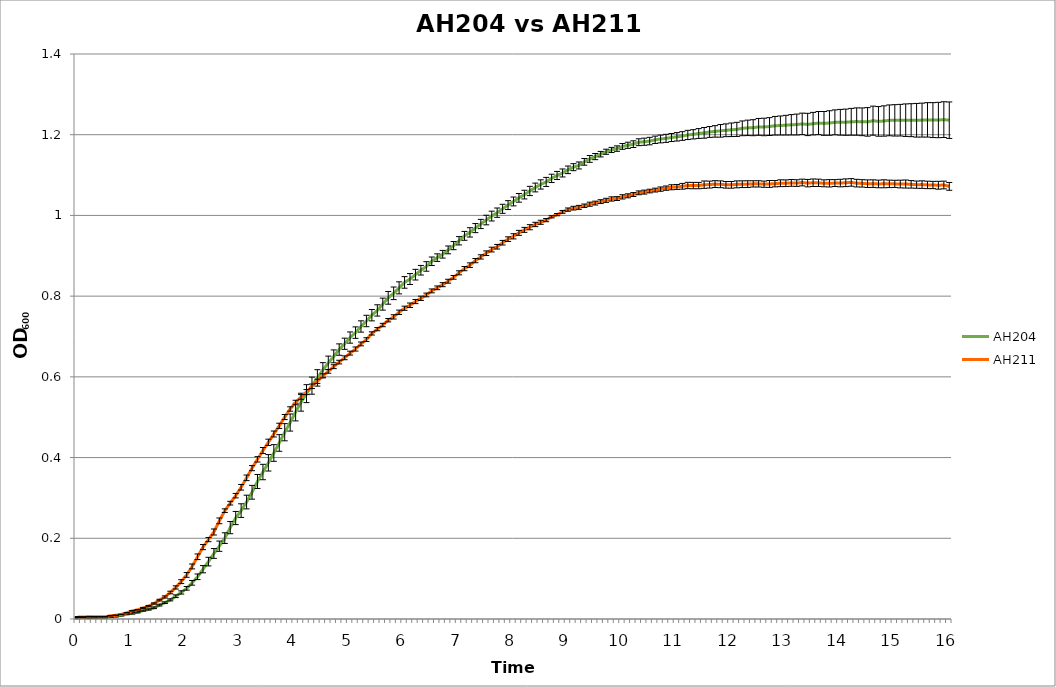
| Category | AH204 | AH211 |
|---|---|---|
| 0.0 | 0.002 | 0.005 |
| nan | 0.004 | 0.005 |
| nan | 0.003 | 0.006 |
| nan | 0.004 | 0.005 |
| nan | 0.004 | 0.005 |
| nan | 0.004 | 0.005 |
| nan | 0.006 | 0.008 |
| nan | 0.007 | 0.009 |
| nan | 0.009 | 0.011 |
| nan | 0.012 | 0.015 |
| 1.0 | 0.014 | 0.02 |
| nan | 0.017 | 0.023 |
| nan | 0.021 | 0.027 |
| nan | 0.024 | 0.032 |
| nan | 0.028 | 0.038 |
| nan | 0.034 | 0.047 |
| nan | 0.04 | 0.055 |
| nan | 0.047 | 0.066 |
| nan | 0.056 | 0.078 |
| nan | 0.066 | 0.093 |
| 2.0 | 0.076 | 0.109 |
| nan | 0.09 | 0.13 |
| nan | 0.105 | 0.154 |
| nan | 0.123 | 0.178 |
| nan | 0.142 | 0.197 |
| nan | 0.162 | 0.216 |
| nan | 0.18 | 0.243 |
| nan | 0.2 | 0.268 |
| nan | 0.226 | 0.287 |
| nan | 0.25 | 0.306 |
| 3.0 | 0.269 | 0.326 |
| nan | 0.29 | 0.35 |
| nan | 0.314 | 0.374 |
| nan | 0.341 | 0.396 |
| nan | 0.364 | 0.417 |
| nan | 0.387 | 0.438 |
| nan | 0.411 | 0.458 |
| nan | 0.436 | 0.479 |
| nan | 0.463 | 0.5 |
| nan | 0.487 | 0.52 |
| 4.0 | 0.513 | 0.536 |
| nan | 0.537 | 0.55 |
| nan | 0.558 | 0.562 |
| nan | 0.578 | 0.577 |
| nan | 0.597 | 0.589 |
| nan | 0.617 | 0.602 |
| nan | 0.635 | 0.614 |
| nan | 0.651 | 0.625 |
| nan | 0.668 | 0.637 |
| nan | 0.682 | 0.647 |
| 5.0 | 0.697 | 0.659 |
| nan | 0.71 | 0.669 |
| nan | 0.725 | 0.682 |
| nan | 0.738 | 0.692 |
| nan | 0.753 | 0.708 |
| nan | 0.765 | 0.718 |
| nan | 0.78 | 0.728 |
| nan | 0.796 | 0.74 |
| nan | 0.807 | 0.749 |
| nan | 0.821 | 0.76 |
| 6.0 | 0.834 | 0.77 |
| nan | 0.842 | 0.777 |
| nan | 0.853 | 0.787 |
| nan | 0.864 | 0.795 |
| nan | 0.874 | 0.803 |
| nan | 0.886 | 0.813 |
| nan | 0.895 | 0.821 |
| nan | 0.904 | 0.828 |
| nan | 0.915 | 0.837 |
| nan | 0.925 | 0.847 |
| 7.0 | 0.937 | 0.858 |
| nan | 0.949 | 0.868 |
| nan | 0.958 | 0.877 |
| nan | 0.969 | 0.888 |
| nan | 0.979 | 0.897 |
| nan | 0.989 | 0.906 |
| nan | 0.998 | 0.915 |
| nan | 1.007 | 0.922 |
| nan | 1.016 | 0.932 |
| nan | 1.026 | 0.941 |
| 8.0 | 1.035 | 0.948 |
| nan | 1.044 | 0.957 |
| nan | 1.052 | 0.964 |
| nan | 1.061 | 0.971 |
| nan | 1.069 | 0.978 |
| nan | 1.077 | 0.983 |
| nan | 1.083 | 0.988 |
| nan | 1.092 | 0.997 |
| nan | 1.099 | 1.002 |
| nan | 1.105 | 1.009 |
| 9.0 | 1.113 | 1.014 |
| nan | 1.12 | 1.018 |
| nan | 1.124 | 1.02 |
| nan | 1.133 | 1.024 |
| nan | 1.14 | 1.028 |
| nan | 1.146 | 1.031 |
| nan | 1.152 | 1.034 |
| nan | 1.158 | 1.037 |
| nan | 1.162 | 1.041 |
| nan | 1.166 | 1.042 |
| 10.0 | 1.171 | 1.046 |
| nan | 1.174 | 1.049 |
| nan | 1.177 | 1.052 |
| nan | 1.181 | 1.056 |
| nan | 1.183 | 1.058 |
| nan | 1.184 | 1.06 |
| nan | 1.187 | 1.063 |
| nan | 1.189 | 1.065 |
| nan | 1.191 | 1.068 |
| nan | 1.193 | 1.07 |
| 11.0 | 1.195 | 1.071 |
| nan | 1.197 | 1.072 |
| nan | 1.199 | 1.074 |
| nan | 1.201 | 1.074 |
| nan | 1.203 | 1.074 |
| nan | 1.205 | 1.076 |
| nan | 1.207 | 1.076 |
| nan | 1.208 | 1.078 |
| nan | 1.21 | 1.077 |
| nan | 1.211 | 1.076 |
| 12.0 | 1.212 | 1.076 |
| nan | 1.213 | 1.077 |
| nan | 1.216 | 1.077 |
| nan | 1.217 | 1.078 |
| nan | 1.217 | 1.078 |
| nan | 1.219 | 1.078 |
| nan | 1.219 | 1.077 |
| nan | 1.22 | 1.078 |
| nan | 1.222 | 1.079 |
| nan | 1.223 | 1.08 |
| 13.0 | 1.224 | 1.08 |
| nan | 1.225 | 1.081 |
| nan | 1.225 | 1.08 |
| nan | 1.227 | 1.082 |
| nan | 1.225 | 1.08 |
| nan | 1.227 | 1.081 |
| nan | 1.229 | 1.081 |
| nan | 1.228 | 1.08 |
| nan | 1.229 | 1.08 |
| nan | 1.231 | 1.08 |
| 14.0 | 1.231 | 1.08 |
| nan | 1.231 | 1.081 |
| nan | 1.232 | 1.082 |
| nan | 1.233 | 1.08 |
| nan | 1.232 | 1.079 |
| nan | 1.232 | 1.079 |
| nan | 1.235 | 1.079 |
| nan | 1.233 | 1.078 |
| nan | 1.234 | 1.078 |
| nan | 1.236 | 1.078 |
| 15.0 | 1.236 | 1.078 |
| nan | 1.236 | 1.078 |
| nan | 1.236 | 1.078 |
| nan | 1.236 | 1.077 |
| nan | 1.236 | 1.076 |
| nan | 1.236 | 1.076 |
| nan | 1.237 | 1.076 |
| nan | 1.236 | 1.075 |
| nan | 1.236 | 1.075 |
| nan | 1.237 | 1.075 |
| 16.0 | 1.236 | 1.072 |